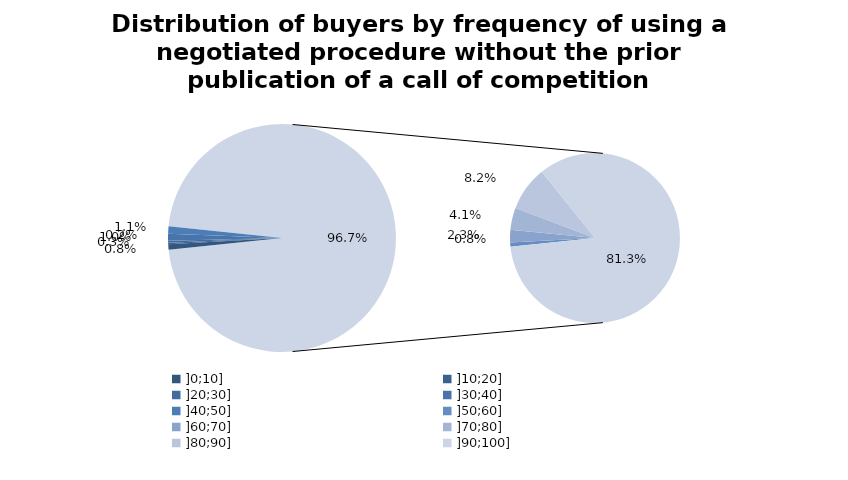
| Category | Series 0 |
|---|---|
| ]0;10]                                             | 17 |
| ]10;20]                                            | 4 |
| ]20;30]                                            | 6 |
| ]30;40]                                            | 21 |
| ]40;50]                                            | 23 |
| ]50;60]                                            | 17 |
| ]60;70]                                            | 49 |
| ]70;80]                                            | 88 |
| ]80;90]                                            | 176 |
| ]90;100]                                           | 1748 |